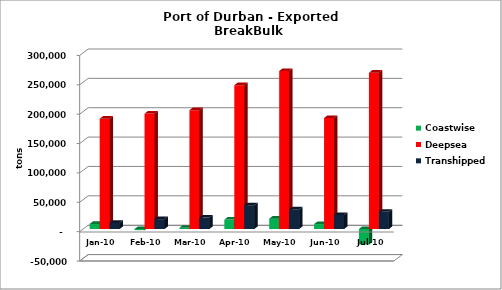
| Category | Coastwise | Deepsea | Series 2 | Transhipped |
|---|---|---|---|---|
| 2010-01-01 | 8673 | 187876 |  | 10371 |
| 2010-02-01 | -1986 | 196561 |  | 16864 |
| 2010-03-01 | 2106 | 202401 |  | 19443 |
| 2010-04-01 | 16040 | 244911 |  | 40483 |
| 2010-05-01 | 17671 | 269052 |  | 33392 |
| 2010-06-01 | 8373 | 189021 |  | 23826 |
| 2010-07-01 | -26434 | 266186 |  | 29170 |